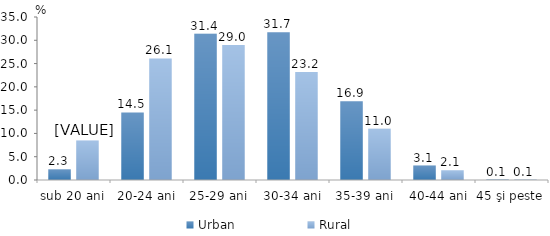
| Category | Urban | Rural |
|---|---|---|
| sub 20 ani | 2.3 | 8.5 |
| 20-24 ani | 14.5 | 26.1 |
| 25-29 ani | 31.4 | 29 |
| 30-34 ani | 31.7 | 23.2 |
| 35-39 ani | 16.9 | 11 |
| 40-44 ani | 3.1 | 2.1 |
| 45 şi peste | 0.1 | 0.1 |